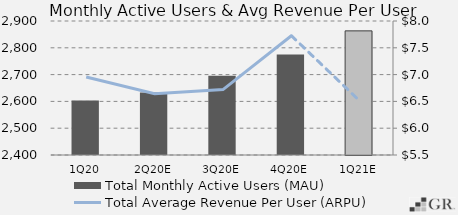
| Category | Total Monthly Active Users (MAU)  |
|---|---|
|  1Q20  | 2603 |
|  2Q20E  | 2633.18 |
|  3Q20E  | 2696.11 |
|  4Q20E  | 2775.07 |
|  1Q21E  | 2863.172 |